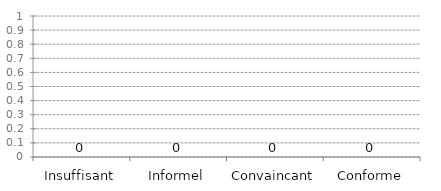
| Category | Histogramme Objectifs AX.x |
|---|---|
| Insuffisant | 0 |
| Informel | 0 |
| Convaincant | 0 |
| Conforme | 0 |